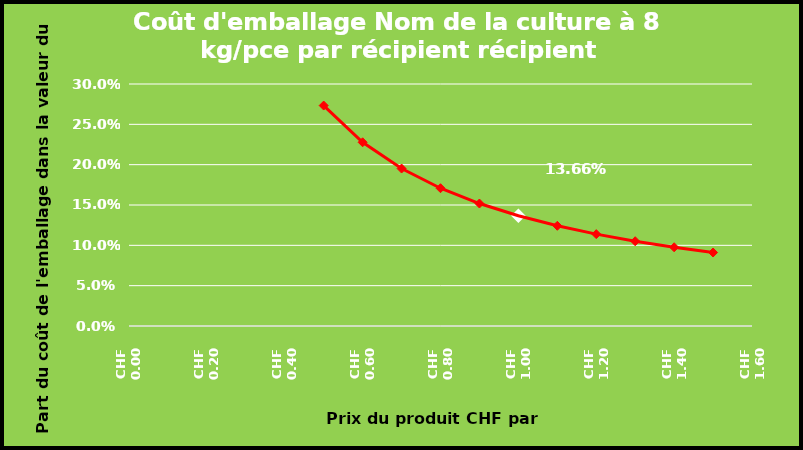
| Category | IFCO 6416 grün |
|---|---|
| 0.5 | 0.273 |
| 0.6 | 0.228 |
| 0.7 | 0.195 |
| 0.8 | 0.171 |
| 0.9 | 0.152 |
| 1.0 | 0.137 |
| 1.1 | 0.124 |
| 1.2 | 0.114 |
| 1.3 | 0.105 |
| 1.4 | 0.098 |
| 1.5 | 0.091 |